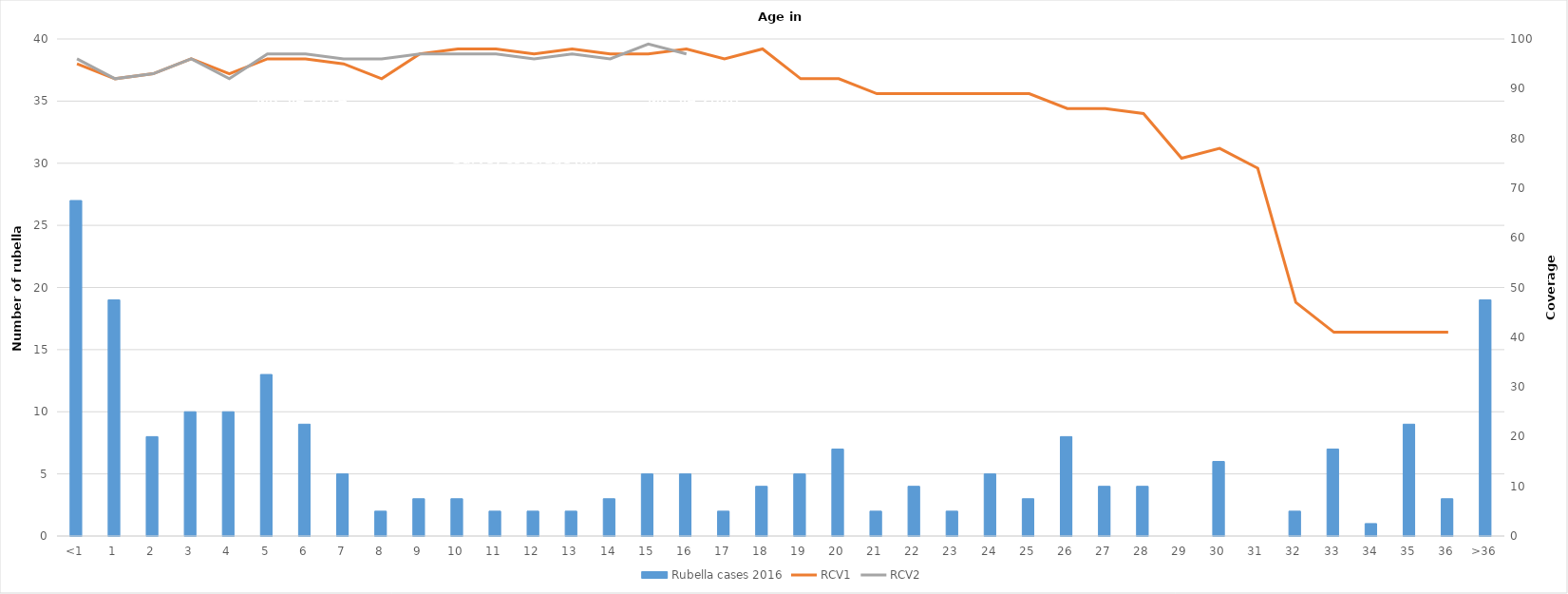
| Category | Rubella cases 2016 |
|---|---|
| <1 | 27 |
| 1 | 19 |
| 2 | 8 |
| 3 | 10 |
| 4 | 10 |
| 5 | 13 |
| 6 | 9 |
| 7 | 5 |
| 8 | 2 |
| 9 | 3 |
| 10 | 3 |
| 11 | 2 |
| 12 | 2 |
| 13 | 2 |
| 14 | 3 |
| 15 | 5 |
| 16 | 5 |
| 17 | 2 |
| 18 | 4 |
| 19 | 5 |
| 20 | 7 |
| 21 | 2 |
| 22 | 4 |
| 23 | 2 |
| 24 | 5 |
| 25 | 3 |
| 26 | 8 |
| 27 | 4 |
| 28 | 4 |
| 29 | 0 |
| 30 | 6 |
| 31 | 0 |
| 32 | 2 |
| 33 | 7 |
| 34 | 1 |
| 35 | 9 |
| 36 | 3 |
| >36 | 19 |